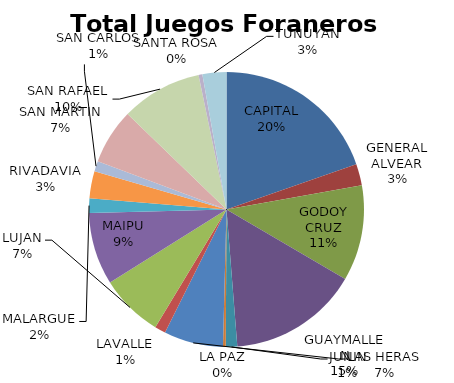
| Category | Total Juegos Foraneros Beneficio |
|---|---|
| CAPITAL | 952121.69 |
| GENERAL ALVEAR | 122956 |
| GODOY CRUZ | 545032.12 |
| GUAYMALLEN | 741991.24 |
| JUNIN | 65015.34 |
| LA PAZ | 15700.27 |
| LAS HERAS | 337694.32 |
| LAVALLE | 61951.35 |
| LUJAN | 360409.05 |
| MAIPU | 412459.21 |
| MALARGUE | 82043.11 |
| RIVADAVIA | 155186.13 |
| SAN CARLOS | 58250.42 |
| SAN MARTIN | 315509.51 |
| SAN RAFAEL  | 461403.24 |
| SANTA ROSA | 21925.29 |
| TUNUYAN | 136242.51 |